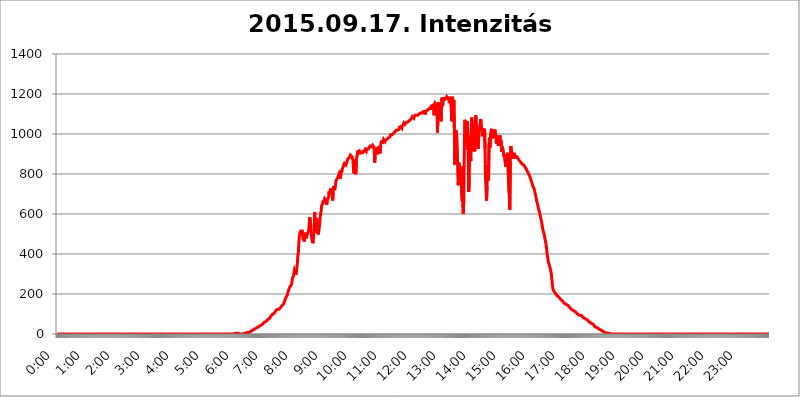
| Category | 2015.09.17. Intenzitás [W/m^2] |
|---|---|
| 0.0 | 0 |
| 0.0006944444444444445 | 0 |
| 0.001388888888888889 | 0 |
| 0.0020833333333333333 | 0 |
| 0.002777777777777778 | 0 |
| 0.003472222222222222 | 0 |
| 0.004166666666666667 | 0 |
| 0.004861111111111111 | 0 |
| 0.005555555555555556 | 0 |
| 0.0062499999999999995 | 0 |
| 0.006944444444444444 | 0 |
| 0.007638888888888889 | 0 |
| 0.008333333333333333 | 0 |
| 0.009027777777777779 | 0 |
| 0.009722222222222222 | 0 |
| 0.010416666666666666 | 0 |
| 0.011111111111111112 | 0 |
| 0.011805555555555555 | 0 |
| 0.012499999999999999 | 0 |
| 0.013194444444444444 | 0 |
| 0.013888888888888888 | 0 |
| 0.014583333333333332 | 0 |
| 0.015277777777777777 | 0 |
| 0.015972222222222224 | 0 |
| 0.016666666666666666 | 0 |
| 0.017361111111111112 | 0 |
| 0.018055555555555557 | 0 |
| 0.01875 | 0 |
| 0.019444444444444445 | 0 |
| 0.02013888888888889 | 0 |
| 0.020833333333333332 | 0 |
| 0.02152777777777778 | 0 |
| 0.022222222222222223 | 0 |
| 0.02291666666666667 | 0 |
| 0.02361111111111111 | 0 |
| 0.024305555555555556 | 0 |
| 0.024999999999999998 | 0 |
| 0.025694444444444447 | 0 |
| 0.02638888888888889 | 0 |
| 0.027083333333333334 | 0 |
| 0.027777777777777776 | 0 |
| 0.02847222222222222 | 0 |
| 0.029166666666666664 | 0 |
| 0.029861111111111113 | 0 |
| 0.030555555555555555 | 0 |
| 0.03125 | 0 |
| 0.03194444444444445 | 0 |
| 0.03263888888888889 | 0 |
| 0.03333333333333333 | 0 |
| 0.034027777777777775 | 0 |
| 0.034722222222222224 | 0 |
| 0.035416666666666666 | 0 |
| 0.036111111111111115 | 0 |
| 0.03680555555555556 | 0 |
| 0.0375 | 0 |
| 0.03819444444444444 | 0 |
| 0.03888888888888889 | 0 |
| 0.03958333333333333 | 0 |
| 0.04027777777777778 | 0 |
| 0.04097222222222222 | 0 |
| 0.041666666666666664 | 0 |
| 0.042361111111111106 | 0 |
| 0.04305555555555556 | 0 |
| 0.043750000000000004 | 0 |
| 0.044444444444444446 | 0 |
| 0.04513888888888889 | 0 |
| 0.04583333333333334 | 0 |
| 0.04652777777777778 | 0 |
| 0.04722222222222222 | 0 |
| 0.04791666666666666 | 0 |
| 0.04861111111111111 | 0 |
| 0.049305555555555554 | 0 |
| 0.049999999999999996 | 0 |
| 0.05069444444444445 | 0 |
| 0.051388888888888894 | 0 |
| 0.052083333333333336 | 0 |
| 0.05277777777777778 | 0 |
| 0.05347222222222222 | 0 |
| 0.05416666666666667 | 0 |
| 0.05486111111111111 | 0 |
| 0.05555555555555555 | 0 |
| 0.05625 | 0 |
| 0.05694444444444444 | 0 |
| 0.057638888888888885 | 0 |
| 0.05833333333333333 | 0 |
| 0.05902777777777778 | 0 |
| 0.059722222222222225 | 0 |
| 0.06041666666666667 | 0 |
| 0.061111111111111116 | 0 |
| 0.06180555555555556 | 0 |
| 0.0625 | 0 |
| 0.06319444444444444 | 0 |
| 0.06388888888888888 | 0 |
| 0.06458333333333334 | 0 |
| 0.06527777777777778 | 0 |
| 0.06597222222222222 | 0 |
| 0.06666666666666667 | 0 |
| 0.06736111111111111 | 0 |
| 0.06805555555555555 | 0 |
| 0.06874999999999999 | 0 |
| 0.06944444444444443 | 0 |
| 0.07013888888888889 | 0 |
| 0.07083333333333333 | 0 |
| 0.07152777777777779 | 0 |
| 0.07222222222222223 | 0 |
| 0.07291666666666667 | 0 |
| 0.07361111111111111 | 0 |
| 0.07430555555555556 | 0 |
| 0.075 | 0 |
| 0.07569444444444444 | 0 |
| 0.0763888888888889 | 0 |
| 0.07708333333333334 | 0 |
| 0.07777777777777778 | 0 |
| 0.07847222222222222 | 0 |
| 0.07916666666666666 | 0 |
| 0.0798611111111111 | 0 |
| 0.08055555555555556 | 0 |
| 0.08125 | 0 |
| 0.08194444444444444 | 0 |
| 0.08263888888888889 | 0 |
| 0.08333333333333333 | 0 |
| 0.08402777777777777 | 0 |
| 0.08472222222222221 | 0 |
| 0.08541666666666665 | 0 |
| 0.08611111111111112 | 0 |
| 0.08680555555555557 | 0 |
| 0.08750000000000001 | 0 |
| 0.08819444444444445 | 0 |
| 0.08888888888888889 | 0 |
| 0.08958333333333333 | 0 |
| 0.09027777777777778 | 0 |
| 0.09097222222222222 | 0 |
| 0.09166666666666667 | 0 |
| 0.09236111111111112 | 0 |
| 0.09305555555555556 | 0 |
| 0.09375 | 0 |
| 0.09444444444444444 | 0 |
| 0.09513888888888888 | 0 |
| 0.09583333333333333 | 0 |
| 0.09652777777777777 | 0 |
| 0.09722222222222222 | 0 |
| 0.09791666666666667 | 0 |
| 0.09861111111111111 | 0 |
| 0.09930555555555555 | 0 |
| 0.09999999999999999 | 0 |
| 0.10069444444444443 | 0 |
| 0.1013888888888889 | 0 |
| 0.10208333333333335 | 0 |
| 0.10277777777777779 | 0 |
| 0.10347222222222223 | 0 |
| 0.10416666666666667 | 0 |
| 0.10486111111111111 | 0 |
| 0.10555555555555556 | 0 |
| 0.10625 | 0 |
| 0.10694444444444444 | 0 |
| 0.1076388888888889 | 0 |
| 0.10833333333333334 | 0 |
| 0.10902777777777778 | 0 |
| 0.10972222222222222 | 0 |
| 0.1111111111111111 | 0 |
| 0.11180555555555556 | 0 |
| 0.11180555555555556 | 0 |
| 0.1125 | 0 |
| 0.11319444444444444 | 0 |
| 0.11388888888888889 | 0 |
| 0.11458333333333333 | 0 |
| 0.11527777777777777 | 0 |
| 0.11597222222222221 | 0 |
| 0.11666666666666665 | 0 |
| 0.1173611111111111 | 0 |
| 0.11805555555555557 | 0 |
| 0.11944444444444445 | 0 |
| 0.12013888888888889 | 0 |
| 0.12083333333333333 | 0 |
| 0.12152777777777778 | 0 |
| 0.12222222222222223 | 0 |
| 0.12291666666666667 | 0 |
| 0.12291666666666667 | 0 |
| 0.12361111111111112 | 0 |
| 0.12430555555555556 | 0 |
| 0.125 | 0 |
| 0.12569444444444444 | 0 |
| 0.12638888888888888 | 0 |
| 0.12708333333333333 | 0 |
| 0.16875 | 0 |
| 0.12847222222222224 | 0 |
| 0.12916666666666668 | 0 |
| 0.12986111111111112 | 0 |
| 0.13055555555555556 | 0 |
| 0.13125 | 0 |
| 0.13194444444444445 | 0 |
| 0.1326388888888889 | 0 |
| 0.13333333333333333 | 0 |
| 0.13402777777777777 | 0 |
| 0.13402777777777777 | 0 |
| 0.13472222222222222 | 0 |
| 0.13541666666666666 | 0 |
| 0.1361111111111111 | 0 |
| 0.13749999999999998 | 0 |
| 0.13819444444444443 | 0 |
| 0.1388888888888889 | 0 |
| 0.13958333333333334 | 0 |
| 0.14027777777777778 | 0 |
| 0.14097222222222222 | 0 |
| 0.14166666666666666 | 0 |
| 0.1423611111111111 | 0 |
| 0.14305555555555557 | 0 |
| 0.14375000000000002 | 0 |
| 0.14444444444444446 | 0 |
| 0.1451388888888889 | 0 |
| 0.1451388888888889 | 0 |
| 0.14652777777777778 | 0 |
| 0.14722222222222223 | 0 |
| 0.14791666666666667 | 0 |
| 0.1486111111111111 | 0 |
| 0.14930555555555555 | 0 |
| 0.15 | 0 |
| 0.15069444444444444 | 0 |
| 0.15138888888888888 | 0 |
| 0.15208333333333332 | 0 |
| 0.15277777777777776 | 0 |
| 0.15347222222222223 | 0 |
| 0.15416666666666667 | 0 |
| 0.15486111111111112 | 0 |
| 0.15555555555555556 | 0 |
| 0.15625 | 0 |
| 0.15694444444444444 | 0 |
| 0.15763888888888888 | 0 |
| 0.15833333333333333 | 0 |
| 0.15902777777777777 | 0 |
| 0.15972222222222224 | 0 |
| 0.16041666666666668 | 0 |
| 0.16111111111111112 | 0 |
| 0.16180555555555556 | 0 |
| 0.1625 | 0 |
| 0.16319444444444445 | 0 |
| 0.1638888888888889 | 0 |
| 0.16458333333333333 | 0 |
| 0.16527777777777777 | 0 |
| 0.16597222222222222 | 0 |
| 0.16666666666666666 | 0 |
| 0.1673611111111111 | 0 |
| 0.16805555555555554 | 0 |
| 0.16874999999999998 | 0 |
| 0.16944444444444443 | 0 |
| 0.17013888888888887 | 0 |
| 0.1708333333333333 | 0 |
| 0.17152777777777775 | 0 |
| 0.17222222222222225 | 0 |
| 0.1729166666666667 | 0 |
| 0.17361111111111113 | 0 |
| 0.17430555555555557 | 0 |
| 0.17500000000000002 | 0 |
| 0.17569444444444446 | 0 |
| 0.1763888888888889 | 0 |
| 0.17708333333333334 | 0 |
| 0.17777777777777778 | 0 |
| 0.17847222222222223 | 0 |
| 0.17916666666666667 | 0 |
| 0.1798611111111111 | 0 |
| 0.18055555555555555 | 0 |
| 0.18125 | 0 |
| 0.18194444444444444 | 0 |
| 0.1826388888888889 | 0 |
| 0.18333333333333335 | 0 |
| 0.1840277777777778 | 0 |
| 0.18472222222222223 | 0 |
| 0.18541666666666667 | 0 |
| 0.18611111111111112 | 0 |
| 0.18680555555555556 | 0 |
| 0.1875 | 0 |
| 0.18819444444444444 | 0 |
| 0.18888888888888888 | 0 |
| 0.18958333333333333 | 0 |
| 0.19027777777777777 | 0 |
| 0.1909722222222222 | 0 |
| 0.19166666666666665 | 0 |
| 0.19236111111111112 | 0 |
| 0.19305555555555554 | 0 |
| 0.19375 | 0 |
| 0.19444444444444445 | 0 |
| 0.1951388888888889 | 0 |
| 0.19583333333333333 | 0 |
| 0.19652777777777777 | 0 |
| 0.19722222222222222 | 0 |
| 0.19791666666666666 | 0 |
| 0.1986111111111111 | 0 |
| 0.19930555555555554 | 0 |
| 0.19999999999999998 | 0 |
| 0.20069444444444443 | 0 |
| 0.20138888888888887 | 0 |
| 0.2020833333333333 | 0 |
| 0.2027777777777778 | 0 |
| 0.2034722222222222 | 0 |
| 0.2041666666666667 | 0 |
| 0.20486111111111113 | 0 |
| 0.20555555555555557 | 0 |
| 0.20625000000000002 | 0 |
| 0.20694444444444446 | 0 |
| 0.2076388888888889 | 0 |
| 0.20833333333333334 | 0 |
| 0.20902777777777778 | 0 |
| 0.20972222222222223 | 0 |
| 0.21041666666666667 | 0 |
| 0.2111111111111111 | 0 |
| 0.21180555555555555 | 0 |
| 0.2125 | 0 |
| 0.21319444444444444 | 0 |
| 0.2138888888888889 | 0 |
| 0.21458333333333335 | 0 |
| 0.2152777777777778 | 0 |
| 0.21597222222222223 | 0 |
| 0.21666666666666667 | 0 |
| 0.21736111111111112 | 0 |
| 0.21805555555555556 | 0 |
| 0.21875 | 0 |
| 0.21944444444444444 | 0 |
| 0.22013888888888888 | 0 |
| 0.22083333333333333 | 0 |
| 0.22152777777777777 | 0 |
| 0.2222222222222222 | 0 |
| 0.22291666666666665 | 0 |
| 0.2236111111111111 | 0 |
| 0.22430555555555556 | 0 |
| 0.225 | 0 |
| 0.22569444444444445 | 0 |
| 0.2263888888888889 | 0 |
| 0.22708333333333333 | 0 |
| 0.22777777777777777 | 0 |
| 0.22847222222222222 | 0 |
| 0.22916666666666666 | 0 |
| 0.2298611111111111 | 0 |
| 0.23055555555555554 | 0 |
| 0.23124999999999998 | 0 |
| 0.23194444444444443 | 0 |
| 0.23263888888888887 | 0 |
| 0.2333333333333333 | 0 |
| 0.2340277777777778 | 0 |
| 0.2347222222222222 | 0 |
| 0.2354166666666667 | 0 |
| 0.23611111111111113 | 0 |
| 0.23680555555555557 | 0 |
| 0.23750000000000002 | 0 |
| 0.23819444444444446 | 0 |
| 0.2388888888888889 | 0 |
| 0.23958333333333334 | 0 |
| 0.24027777777777778 | 0 |
| 0.24097222222222223 | 0 |
| 0.24166666666666667 | 0 |
| 0.2423611111111111 | 0 |
| 0.24305555555555555 | 0 |
| 0.24375 | 0 |
| 0.24444444444444446 | 0 |
| 0.24513888888888888 | 0 |
| 0.24583333333333335 | 0 |
| 0.2465277777777778 | 0 |
| 0.24722222222222223 | 0 |
| 0.24791666666666667 | 0 |
| 0.24861111111111112 | 0 |
| 0.24930555555555556 | 0 |
| 0.25 | 3.525 |
| 0.25069444444444444 | 3.525 |
| 0.2513888888888889 | 3.525 |
| 0.2520833333333333 | 3.525 |
| 0.25277777777777777 | 3.525 |
| 0.2534722222222222 | 3.525 |
| 0.25416666666666665 | 3.525 |
| 0.2548611111111111 | 0 |
| 0.2555555555555556 | 0 |
| 0.25625000000000003 | 0 |
| 0.2569444444444445 | 0 |
| 0.2576388888888889 | 0 |
| 0.25833333333333336 | 0 |
| 0.2590277777777778 | 0 |
| 0.25972222222222224 | 0 |
| 0.2604166666666667 | 0 |
| 0.2611111111111111 | 0 |
| 0.26180555555555557 | 0 |
| 0.2625 | 3.525 |
| 0.26319444444444445 | 3.525 |
| 0.2638888888888889 | 3.525 |
| 0.26458333333333334 | 3.525 |
| 0.2652777777777778 | 3.525 |
| 0.2659722222222222 | 7.887 |
| 0.26666666666666666 | 7.887 |
| 0.2673611111111111 | 7.887 |
| 0.26805555555555555 | 7.887 |
| 0.26875 | 7.887 |
| 0.26944444444444443 | 12.257 |
| 0.2701388888888889 | 12.257 |
| 0.2708333333333333 | 12.257 |
| 0.27152777777777776 | 12.257 |
| 0.2722222222222222 | 16.636 |
| 0.27291666666666664 | 16.636 |
| 0.2736111111111111 | 21.024 |
| 0.2743055555555555 | 21.024 |
| 0.27499999999999997 | 21.024 |
| 0.27569444444444446 | 21.024 |
| 0.27638888888888885 | 25.419 |
| 0.27708333333333335 | 25.419 |
| 0.2777777777777778 | 25.419 |
| 0.27847222222222223 | 29.823 |
| 0.2791666666666667 | 29.823 |
| 0.2798611111111111 | 29.823 |
| 0.28055555555555556 | 34.234 |
| 0.28125 | 34.234 |
| 0.28194444444444444 | 38.653 |
| 0.2826388888888889 | 38.653 |
| 0.2833333333333333 | 38.653 |
| 0.28402777777777777 | 43.079 |
| 0.2847222222222222 | 43.079 |
| 0.28541666666666665 | 43.079 |
| 0.28611111111111115 | 47.511 |
| 0.28680555555555554 | 47.511 |
| 0.28750000000000003 | 47.511 |
| 0.2881944444444445 | 51.951 |
| 0.2888888888888889 | 51.951 |
| 0.28958333333333336 | 56.398 |
| 0.2902777777777778 | 56.398 |
| 0.29097222222222224 | 56.398 |
| 0.2916666666666667 | 60.85 |
| 0.2923611111111111 | 60.85 |
| 0.29305555555555557 | 65.31 |
| 0.29375 | 65.31 |
| 0.29444444444444445 | 69.775 |
| 0.2951388888888889 | 69.775 |
| 0.29583333333333334 | 74.246 |
| 0.2965277777777778 | 74.246 |
| 0.2972222222222222 | 78.722 |
| 0.29791666666666666 | 78.722 |
| 0.2986111111111111 | 83.205 |
| 0.29930555555555555 | 87.692 |
| 0.3 | 87.692 |
| 0.30069444444444443 | 92.184 |
| 0.3013888888888889 | 96.682 |
| 0.3020833333333333 | 96.682 |
| 0.30277777777777776 | 101.184 |
| 0.3034722222222222 | 101.184 |
| 0.30416666666666664 | 105.69 |
| 0.3048611111111111 | 105.69 |
| 0.3055555555555555 | 110.201 |
| 0.30624999999999997 | 114.716 |
| 0.3069444444444444 | 119.235 |
| 0.3076388888888889 | 123.758 |
| 0.30833333333333335 | 123.758 |
| 0.3090277777777778 | 123.758 |
| 0.30972222222222223 | 123.758 |
| 0.3104166666666667 | 123.758 |
| 0.3111111111111111 | 123.758 |
| 0.31180555555555556 | 128.284 |
| 0.3125 | 128.284 |
| 0.31319444444444444 | 132.814 |
| 0.3138888888888889 | 137.347 |
| 0.3145833333333333 | 137.347 |
| 0.31527777777777777 | 141.884 |
| 0.3159722222222222 | 141.884 |
| 0.31666666666666665 | 146.423 |
| 0.31736111111111115 | 150.964 |
| 0.31805555555555554 | 155.509 |
| 0.31875000000000003 | 160.056 |
| 0.3194444444444445 | 169.156 |
| 0.3201388888888889 | 178.264 |
| 0.32083333333333336 | 182.82 |
| 0.3215277777777778 | 187.378 |
| 0.32222222222222224 | 187.378 |
| 0.3229166666666667 | 196.497 |
| 0.3236111111111111 | 210.182 |
| 0.32430555555555557 | 210.182 |
| 0.325 | 223.873 |
| 0.32569444444444445 | 228.436 |
| 0.3263888888888889 | 237.564 |
| 0.32708333333333334 | 242.127 |
| 0.3277777777777778 | 242.127 |
| 0.3284722222222222 | 246.689 |
| 0.32916666666666666 | 260.373 |
| 0.3298611111111111 | 278.603 |
| 0.33055555555555555 | 278.603 |
| 0.33125 | 287.709 |
| 0.33194444444444443 | 305.898 |
| 0.3326388888888889 | 319.517 |
| 0.3333333333333333 | 314.98 |
| 0.3340277777777778 | 305.898 |
| 0.3347222222222222 | 296.808 |
| 0.3354166666666667 | 314.98 |
| 0.3361111111111111 | 333.113 |
| 0.3368055555555556 | 355.712 |
| 0.33749999999999997 | 391.685 |
| 0.33819444444444446 | 409.574 |
| 0.33888888888888885 | 458.38 |
| 0.33958333333333335 | 489.108 |
| 0.34027777777777773 | 502.192 |
| 0.34097222222222223 | 497.836 |
| 0.3416666666666666 | 515.223 |
| 0.3423611111111111 | 510.885 |
| 0.3430555555555555 | 519.555 |
| 0.34375 | 515.223 |
| 0.3444444444444445 | 484.735 |
| 0.3451388888888889 | 471.582 |
| 0.3458333333333334 | 489.108 |
| 0.34652777777777777 | 462.786 |
| 0.34722222222222227 | 506.542 |
| 0.34791666666666665 | 493.475 |
| 0.34861111111111115 | 475.972 |
| 0.34930555555555554 | 489.108 |
| 0.35000000000000003 | 493.475 |
| 0.3506944444444444 | 497.836 |
| 0.3513888888888889 | 502.192 |
| 0.3520833333333333 | 502.192 |
| 0.3527777777777778 | 519.555 |
| 0.3534722222222222 | 553.986 |
| 0.3541666666666667 | 583.779 |
| 0.3548611111111111 | 588.009 |
| 0.35555555555555557 | 536.82 |
| 0.35625 | 497.836 |
| 0.35694444444444445 | 480.356 |
| 0.3576388888888889 | 475.972 |
| 0.35833333333333334 | 453.968 |
| 0.3590277777777778 | 462.786 |
| 0.3597222222222222 | 497.836 |
| 0.36041666666666666 | 532.513 |
| 0.3611111111111111 | 609.062 |
| 0.36180555555555555 | 536.82 |
| 0.3625 | 506.542 |
| 0.36319444444444443 | 532.513 |
| 0.3638888888888889 | 579.542 |
| 0.3645833333333333 | 558.261 |
| 0.3652777777777778 | 515.223 |
| 0.3659722222222222 | 497.836 |
| 0.3666666666666667 | 510.885 |
| 0.3673611111111111 | 515.223 |
| 0.3680555555555556 | 549.704 |
| 0.36874999999999997 | 583.779 |
| 0.36944444444444446 | 583.779 |
| 0.37013888888888885 | 617.436 |
| 0.37083333333333335 | 642.4 |
| 0.37152777777777773 | 642.4 |
| 0.37222222222222223 | 650.667 |
| 0.3729166666666666 | 667.123 |
| 0.3736111111111111 | 654.791 |
| 0.3743055555555555 | 658.909 |
| 0.375 | 675.311 |
| 0.3756944444444445 | 675.311 |
| 0.3763888888888889 | 667.123 |
| 0.3770833333333334 | 663.019 |
| 0.37777777777777777 | 646.537 |
| 0.37847222222222227 | 658.909 |
| 0.37916666666666665 | 675.311 |
| 0.37986111111111115 | 675.311 |
| 0.38055555555555554 | 683.473 |
| 0.38125000000000003 | 711.832 |
| 0.3819444444444444 | 695.666 |
| 0.3826388888888889 | 711.832 |
| 0.3833333333333333 | 727.896 |
| 0.3840277777777778 | 695.666 |
| 0.3847222222222222 | 723.889 |
| 0.3854166666666667 | 703.762 |
| 0.3861111111111111 | 667.123 |
| 0.38680555555555557 | 679.395 |
| 0.3875 | 739.877 |
| 0.38819444444444445 | 731.896 |
| 0.3888888888888889 | 719.877 |
| 0.38958333333333334 | 727.896 |
| 0.3902777777777778 | 727.896 |
| 0.3909722222222222 | 767.62 |
| 0.39166666666666666 | 763.674 |
| 0.3923611111111111 | 767.62 |
| 0.39305555555555555 | 779.42 |
| 0.39375 | 783.342 |
| 0.39444444444444443 | 791.169 |
| 0.3951388888888889 | 798.974 |
| 0.3958333333333333 | 795.074 |
| 0.3965277777777778 | 795.074 |
| 0.3972222222222222 | 775.492 |
| 0.3979166666666667 | 818.392 |
| 0.3986111111111111 | 806.757 |
| 0.3993055555555556 | 818.392 |
| 0.39999999999999997 | 818.392 |
| 0.40069444444444446 | 814.519 |
| 0.40138888888888885 | 841.526 |
| 0.40208333333333335 | 845.365 |
| 0.40277777777777773 | 853.029 |
| 0.40347222222222223 | 856.855 |
| 0.4041666666666666 | 853.029 |
| 0.4048611111111111 | 845.365 |
| 0.4055555555555555 | 853.029 |
| 0.40625 | 856.855 |
| 0.4069444444444445 | 868.305 |
| 0.4076388888888889 | 875.918 |
| 0.4083333333333334 | 875.918 |
| 0.40902777777777777 | 879.719 |
| 0.40972222222222227 | 883.516 |
| 0.41041666666666665 | 887.309 |
| 0.41111111111111115 | 894.885 |
| 0.41180555555555554 | 898.668 |
| 0.41250000000000003 | 894.885 |
| 0.4131944444444444 | 887.309 |
| 0.4138888888888889 | 887.309 |
| 0.4145833333333333 | 872.114 |
| 0.4152777777777778 | 837.682 |
| 0.4159722222222222 | 802.868 |
| 0.4166666666666667 | 818.392 |
| 0.4173611111111111 | 872.114 |
| 0.41805555555555557 | 810.641 |
| 0.41875 | 798.974 |
| 0.41944444444444445 | 864.493 |
| 0.4201388888888889 | 887.309 |
| 0.42083333333333334 | 894.885 |
| 0.4215277777777778 | 917.534 |
| 0.4222222222222222 | 909.996 |
| 0.42291666666666666 | 917.534 |
| 0.4236111111111111 | 898.668 |
| 0.42430555555555555 | 913.766 |
| 0.425 | 917.534 |
| 0.42569444444444443 | 909.996 |
| 0.4263888888888889 | 906.223 |
| 0.4270833333333333 | 909.996 |
| 0.4277777777777778 | 906.223 |
| 0.4284722222222222 | 906.223 |
| 0.4291666666666667 | 913.766 |
| 0.4298611111111111 | 913.766 |
| 0.4305555555555556 | 917.534 |
| 0.43124999999999997 | 913.766 |
| 0.43194444444444446 | 921.298 |
| 0.43263888888888885 | 921.298 |
| 0.43333333333333335 | 913.766 |
| 0.43402777777777773 | 925.06 |
| 0.43472222222222223 | 928.819 |
| 0.4354166666666666 | 925.06 |
| 0.4361111111111111 | 925.06 |
| 0.4368055555555555 | 928.819 |
| 0.4375 | 932.576 |
| 0.4381944444444445 | 932.576 |
| 0.4388888888888889 | 940.082 |
| 0.4395833333333334 | 936.33 |
| 0.44027777777777777 | 940.082 |
| 0.44097222222222227 | 936.33 |
| 0.44166666666666665 | 940.082 |
| 0.44236111111111115 | 943.832 |
| 0.44305555555555554 | 943.832 |
| 0.44375000000000003 | 947.58 |
| 0.4444444444444444 | 932.576 |
| 0.4451388888888889 | 856.855 |
| 0.4458333333333333 | 887.309 |
| 0.4465277777777778 | 932.576 |
| 0.4472222222222222 | 936.33 |
| 0.4479166666666667 | 921.298 |
| 0.4486111111111111 | 898.668 |
| 0.44930555555555557 | 898.668 |
| 0.45 | 925.06 |
| 0.45069444444444445 | 925.06 |
| 0.4513888888888889 | 940.082 |
| 0.45208333333333334 | 921.298 |
| 0.4527777777777778 | 902.447 |
| 0.4534722222222222 | 936.33 |
| 0.45416666666666666 | 958.814 |
| 0.4548611111111111 | 966.295 |
| 0.45555555555555555 | 951.327 |
| 0.45625 | 947.58 |
| 0.45694444444444443 | 966.295 |
| 0.4576388888888889 | 973.772 |
| 0.4583333333333333 | 970.034 |
| 0.4590277777777778 | 970.034 |
| 0.4597222222222222 | 962.555 |
| 0.4604166666666667 | 970.034 |
| 0.4611111111111111 | 970.034 |
| 0.4618055555555556 | 970.034 |
| 0.46249999999999997 | 973.772 |
| 0.46319444444444446 | 977.508 |
| 0.46388888888888885 | 977.508 |
| 0.46458333333333335 | 981.244 |
| 0.46527777777777773 | 977.508 |
| 0.46597222222222223 | 984.98 |
| 0.4666666666666666 | 984.98 |
| 0.4673611111111111 | 996.182 |
| 0.4680555555555555 | 996.182 |
| 0.46875 | 996.182 |
| 0.4694444444444445 | 996.182 |
| 0.4701388888888889 | 999.916 |
| 0.4708333333333334 | 999.916 |
| 0.47152777777777777 | 1003.65 |
| 0.47222222222222227 | 1007.383 |
| 0.47291666666666665 | 1003.65 |
| 0.47361111111111115 | 1011.118 |
| 0.47430555555555554 | 1014.852 |
| 0.47500000000000003 | 1018.587 |
| 0.4756944444444444 | 1022.323 |
| 0.4763888888888889 | 1014.852 |
| 0.4770833333333333 | 1018.587 |
| 0.4777777777777778 | 1022.323 |
| 0.4784722222222222 | 1022.323 |
| 0.4791666666666667 | 1022.323 |
| 0.4798611111111111 | 1033.537 |
| 0.48055555555555557 | 1029.798 |
| 0.48125 | 1037.277 |
| 0.48194444444444445 | 1037.277 |
| 0.4826388888888889 | 1037.277 |
| 0.48333333333333334 | 1029.798 |
| 0.4840277777777778 | 1041.019 |
| 0.4847222222222222 | 1037.277 |
| 0.48541666666666666 | 1044.762 |
| 0.4861111111111111 | 1056.004 |
| 0.48680555555555555 | 1052.255 |
| 0.4875 | 1048.508 |
| 0.48819444444444443 | 1052.255 |
| 0.4888888888888889 | 1056.004 |
| 0.4895833333333333 | 1059.756 |
| 0.4902777777777778 | 1052.255 |
| 0.4909722222222222 | 1059.756 |
| 0.4916666666666667 | 1059.756 |
| 0.4923611111111111 | 1063.51 |
| 0.4930555555555556 | 1063.51 |
| 0.49374999999999997 | 1059.756 |
| 0.49444444444444446 | 1067.267 |
| 0.49513888888888885 | 1071.027 |
| 0.49583333333333335 | 1067.267 |
| 0.49652777777777773 | 1074.789 |
| 0.49722222222222223 | 1078.555 |
| 0.4979166666666666 | 1086.097 |
| 0.4986111111111111 | 1082.324 |
| 0.4993055555555555 | 1082.324 |
| 0.5 | 1078.555 |
| 0.5006944444444444 | 1078.555 |
| 0.5013888888888889 | 1093.653 |
| 0.5020833333333333 | 1093.653 |
| 0.5027777777777778 | 1097.437 |
| 0.5034722222222222 | 1093.653 |
| 0.5041666666666667 | 1097.437 |
| 0.5048611111111111 | 1093.653 |
| 0.5055555555555555 | 1093.653 |
| 0.50625 | 1093.653 |
| 0.5069444444444444 | 1097.437 |
| 0.5076388888888889 | 1101.226 |
| 0.5083333333333333 | 1101.226 |
| 0.5090277777777777 | 1105.019 |
| 0.5097222222222222 | 1105.019 |
| 0.5104166666666666 | 1108.816 |
| 0.5111111111111112 | 1108.816 |
| 0.5118055555555555 | 1105.019 |
| 0.5125000000000001 | 1105.019 |
| 0.5131944444444444 | 1112.618 |
| 0.513888888888889 | 1112.618 |
| 0.5145833333333333 | 1112.618 |
| 0.5152777777777778 | 1112.618 |
| 0.5159722222222222 | 1097.437 |
| 0.5166666666666667 | 1108.816 |
| 0.517361111111111 | 1112.618 |
| 0.5180555555555556 | 1116.426 |
| 0.5187499999999999 | 1120.238 |
| 0.5194444444444445 | 1116.426 |
| 0.5201388888888888 | 1120.238 |
| 0.5208333333333334 | 1124.056 |
| 0.5215277777777778 | 1127.879 |
| 0.5222222222222223 | 1127.879 |
| 0.5229166666666667 | 1131.708 |
| 0.5236111111111111 | 1127.879 |
| 0.5243055555555556 | 1139.384 |
| 0.525 | 1135.543 |
| 0.5256944444444445 | 1143.232 |
| 0.5263888888888889 | 1143.232 |
| 0.5270833333333333 | 1143.232 |
| 0.5277777777777778 | 1131.708 |
| 0.5284722222222222 | 1093.653 |
| 0.5291666666666667 | 1147.086 |
| 0.5298611111111111 | 1154.814 |
| 0.5305555555555556 | 1158.689 |
| 0.53125 | 1147.086 |
| 0.5319444444444444 | 1143.232 |
| 0.5326388888888889 | 1101.226 |
| 0.5333333333333333 | 1007.383 |
| 0.5340277777777778 | 1139.384 |
| 0.5347222222222222 | 1158.689 |
| 0.5354166666666667 | 1108.816 |
| 0.5361111111111111 | 1093.653 |
| 0.5368055555555555 | 1082.324 |
| 0.5375 | 1112.618 |
| 0.5381944444444444 | 1063.51 |
| 0.5388888888888889 | 1150.946 |
| 0.5395833333333333 | 1182.099 |
| 0.5402777777777777 | 1139.384 |
| 0.5409722222222222 | 1150.946 |
| 0.5416666666666666 | 1182.099 |
| 0.5423611111111112 | 1178.177 |
| 0.5430555555555555 | 1166.46 |
| 0.5437500000000001 | 1178.177 |
| 0.5444444444444444 | 1178.177 |
| 0.545138888888889 | 1178.177 |
| 0.5458333333333333 | 1178.177 |
| 0.5465277777777778 | 1186.03 |
| 0.5472222222222222 | 1182.099 |
| 0.5479166666666667 | 1186.03 |
| 0.548611111111111 | 1178.177 |
| 0.5493055555555556 | 1178.177 |
| 0.5499999999999999 | 1154.814 |
| 0.5506944444444445 | 1178.177 |
| 0.5513888888888888 | 1186.03 |
| 0.5520833333333334 | 1147.086 |
| 0.5527777777777778 | 1112.618 |
| 0.5534722222222223 | 1063.51 |
| 0.5541666666666667 | 1186.03 |
| 0.5548611111111111 | 1170.358 |
| 0.5555555555555556 | 1154.814 |
| 0.55625 | 1170.358 |
| 0.5569444444444445 | 1029.798 |
| 0.5576388888888889 | 845.365 |
| 0.5583333333333333 | 970.034 |
| 0.5590277777777778 | 1018.587 |
| 0.5597222222222222 | 1011.118 |
| 0.5604166666666667 | 984.98 |
| 0.5611111111111111 | 925.06 |
| 0.5618055555555556 | 806.757 |
| 0.5625 | 743.859 |
| 0.5631944444444444 | 856.855 |
| 0.5638888888888889 | 837.682 |
| 0.5645833333333333 | 818.392 |
| 0.5652777777777778 | 798.974 |
| 0.5659722222222222 | 814.519 |
| 0.5666666666666667 | 837.682 |
| 0.5673611111111111 | 687.544 |
| 0.5680555555555555 | 663.019 |
| 0.56875 | 711.832 |
| 0.5694444444444444 | 600.661 |
| 0.5701388888888889 | 667.123 |
| 0.5708333333333333 | 887.309 |
| 0.5715277777777777 | 1071.027 |
| 0.5722222222222222 | 1059.756 |
| 0.5729166666666666 | 1044.762 |
| 0.5736111111111112 | 984.98 |
| 0.5743055555555555 | 966.295 |
| 0.5750000000000001 | 1063.51 |
| 0.5756944444444444 | 921.298 |
| 0.576388888888889 | 970.034 |
| 0.5770833333333333 | 711.832 |
| 0.5777777777777778 | 779.42 |
| 0.5784722222222222 | 928.819 |
| 0.5791666666666667 | 992.448 |
| 0.579861111111111 | 864.493 |
| 0.5805555555555556 | 1014.852 |
| 0.5812499999999999 | 1082.324 |
| 0.5819444444444445 | 1052.255 |
| 0.5826388888888888 | 1041.019 |
| 0.5833333333333334 | 913.766 |
| 0.5840277777777778 | 970.034 |
| 0.5847222222222223 | 1037.277 |
| 0.5854166666666667 | 913.766 |
| 0.5861111111111111 | 984.98 |
| 0.5868055555555556 | 1093.653 |
| 0.5875 | 1074.789 |
| 0.5881944444444445 | 1029.798 |
| 0.5888888888888889 | 958.814 |
| 0.5895833333333333 | 962.555 |
| 0.5902777777777778 | 925.06 |
| 0.5909722222222222 | 962.555 |
| 0.5916666666666667 | 1007.383 |
| 0.5923611111111111 | 1033.537 |
| 0.5930555555555556 | 1048.508 |
| 0.59375 | 1074.789 |
| 0.5944444444444444 | 1059.756 |
| 0.5951388888888889 | 1026.06 |
| 0.5958333333333333 | 1014.852 |
| 0.5965277777777778 | 988.714 |
| 0.5972222222222222 | 1026.06 |
| 0.5979166666666667 | 1026.06 |
| 0.5986111111111111 | 1007.383 |
| 0.5993055555555555 | 1026.06 |
| 0.6 | 925.06 |
| 0.6006944444444444 | 771.559 |
| 0.6013888888888889 | 735.89 |
| 0.6020833333333333 | 667.123 |
| 0.6027777777777777 | 735.89 |
| 0.6034722222222222 | 845.365 |
| 0.6041666666666666 | 833.834 |
| 0.6048611111111112 | 767.62 |
| 0.6055555555555555 | 947.58 |
| 0.6062500000000001 | 981.244 |
| 0.6069444444444444 | 932.576 |
| 0.607638888888889 | 996.182 |
| 0.6083333333333333 | 1011.118 |
| 0.6090277777777778 | 1026.06 |
| 0.6097222222222222 | 977.508 |
| 0.6104166666666667 | 996.182 |
| 0.611111111111111 | 1003.65 |
| 0.6118055555555556 | 981.244 |
| 0.6124999999999999 | 977.508 |
| 0.6131944444444445 | 1014.852 |
| 0.6138888888888888 | 1022.323 |
| 0.6145833333333334 | 981.244 |
| 0.6152777777777778 | 996.182 |
| 0.6159722222222223 | 951.327 |
| 0.6166666666666667 | 973.772 |
| 0.6173611111111111 | 981.244 |
| 0.6180555555555556 | 977.508 |
| 0.61875 | 940.082 |
| 0.6194444444444445 | 958.814 |
| 0.6201388888888889 | 940.082 |
| 0.6208333333333333 | 992.448 |
| 0.6215277777777778 | 955.071 |
| 0.6222222222222222 | 970.034 |
| 0.6229166666666667 | 940.082 |
| 0.6236111111111111 | 909.996 |
| 0.6243055555555556 | 936.33 |
| 0.625 | 925.06 |
| 0.6256944444444444 | 913.766 |
| 0.6263888888888889 | 887.309 |
| 0.6270833333333333 | 898.668 |
| 0.6277777777777778 | 898.668 |
| 0.6284722222222222 | 856.855 |
| 0.6291666666666667 | 837.682 |
| 0.6298611111111111 | 883.516 |
| 0.6305555555555555 | 837.682 |
| 0.63125 | 883.516 |
| 0.6319444444444444 | 906.223 |
| 0.6326388888888889 | 802.868 |
| 0.6333333333333333 | 711.832 |
| 0.6340277777777777 | 695.666 |
| 0.6347222222222222 | 621.613 |
| 0.6354166666666666 | 860.676 |
| 0.6361111111111112 | 940.082 |
| 0.6368055555555555 | 917.534 |
| 0.6375000000000001 | 909.996 |
| 0.6381944444444444 | 898.668 |
| 0.638888888888889 | 898.668 |
| 0.6395833333333333 | 875.918 |
| 0.6402777777777778 | 887.309 |
| 0.6409722222222222 | 906.223 |
| 0.6416666666666667 | 875.918 |
| 0.642361111111111 | 891.099 |
| 0.6430555555555556 | 894.885 |
| 0.6437499999999999 | 891.099 |
| 0.6444444444444445 | 887.309 |
| 0.6451388888888888 | 883.516 |
| 0.6458333333333334 | 879.719 |
| 0.6465277777777778 | 875.918 |
| 0.6472222222222223 | 872.114 |
| 0.6479166666666667 | 868.305 |
| 0.6486111111111111 | 864.493 |
| 0.6493055555555556 | 860.676 |
| 0.65 | 860.676 |
| 0.6506944444444445 | 856.855 |
| 0.6513888888888889 | 853.029 |
| 0.6520833333333333 | 849.199 |
| 0.6527777777777778 | 849.199 |
| 0.6534722222222222 | 845.365 |
| 0.6541666666666667 | 845.365 |
| 0.6548611111111111 | 841.526 |
| 0.6555555555555556 | 837.682 |
| 0.65625 | 833.834 |
| 0.6569444444444444 | 829.981 |
| 0.6576388888888889 | 826.123 |
| 0.6583333333333333 | 822.26 |
| 0.6590277777777778 | 814.519 |
| 0.6597222222222222 | 810.641 |
| 0.6604166666666667 | 806.757 |
| 0.6611111111111111 | 798.974 |
| 0.6618055555555555 | 795.074 |
| 0.6625 | 791.169 |
| 0.6631944444444444 | 783.342 |
| 0.6638888888888889 | 775.492 |
| 0.6645833333333333 | 767.62 |
| 0.6652777777777777 | 759.723 |
| 0.6659722222222222 | 751.803 |
| 0.6666666666666666 | 743.859 |
| 0.6673611111111111 | 735.89 |
| 0.6680555555555556 | 731.896 |
| 0.6687500000000001 | 727.896 |
| 0.6694444444444444 | 715.858 |
| 0.6701388888888888 | 703.762 |
| 0.6708333333333334 | 695.666 |
| 0.6715277777777778 | 683.473 |
| 0.6722222222222222 | 667.123 |
| 0.6729166666666666 | 663.019 |
| 0.6736111111111112 | 650.667 |
| 0.6743055555555556 | 638.256 |
| 0.6749999999999999 | 625.784 |
| 0.6756944444444444 | 621.613 |
| 0.6763888888888889 | 609.062 |
| 0.6770833333333334 | 596.45 |
| 0.6777777777777777 | 583.779 |
| 0.6784722222222223 | 575.299 |
| 0.6791666666666667 | 562.53 |
| 0.6798611111111111 | 549.704 |
| 0.6805555555555555 | 532.513 |
| 0.68125 | 519.555 |
| 0.6819444444444445 | 515.223 |
| 0.6826388888888889 | 502.192 |
| 0.6833333333333332 | 489.108 |
| 0.6840277777777778 | 475.972 |
| 0.6847222222222222 | 462.786 |
| 0.6854166666666667 | 449.551 |
| 0.686111111111111 | 431.833 |
| 0.6868055555555556 | 409.574 |
| 0.6875 | 391.685 |
| 0.6881944444444444 | 373.729 |
| 0.688888888888889 | 360.221 |
| 0.6895833333333333 | 351.198 |
| 0.6902777777777778 | 342.162 |
| 0.6909722222222222 | 333.113 |
| 0.6916666666666668 | 324.052 |
| 0.6923611111111111 | 310.44 |
| 0.6930555555555555 | 296.808 |
| 0.69375 | 269.49 |
| 0.6944444444444445 | 246.689 |
| 0.6951388888888889 | 228.436 |
| 0.6958333333333333 | 219.309 |
| 0.6965277777777777 | 214.746 |
| 0.6972222222222223 | 210.182 |
| 0.6979166666666666 | 205.62 |
| 0.6986111111111111 | 205.62 |
| 0.6993055555555556 | 201.058 |
| 0.7000000000000001 | 196.497 |
| 0.7006944444444444 | 191.937 |
| 0.7013888888888888 | 191.937 |
| 0.7020833333333334 | 187.378 |
| 0.7027777777777778 | 187.378 |
| 0.7034722222222222 | 182.82 |
| 0.7041666666666666 | 182.82 |
| 0.7048611111111112 | 178.264 |
| 0.7055555555555556 | 173.709 |
| 0.7062499999999999 | 173.709 |
| 0.7069444444444444 | 169.156 |
| 0.7076388888888889 | 169.156 |
| 0.7083333333333334 | 164.605 |
| 0.7090277777777777 | 164.605 |
| 0.7097222222222223 | 160.056 |
| 0.7104166666666667 | 155.509 |
| 0.7111111111111111 | 155.509 |
| 0.7118055555555555 | 155.509 |
| 0.7125 | 150.964 |
| 0.7131944444444445 | 146.423 |
| 0.7138888888888889 | 146.423 |
| 0.7145833333333332 | 146.423 |
| 0.7152777777777778 | 141.884 |
| 0.7159722222222222 | 141.884 |
| 0.7166666666666667 | 141.884 |
| 0.717361111111111 | 137.347 |
| 0.7180555555555556 | 137.347 |
| 0.71875 | 132.814 |
| 0.7194444444444444 | 132.814 |
| 0.720138888888889 | 128.284 |
| 0.7208333333333333 | 123.758 |
| 0.7215277777777778 | 123.758 |
| 0.7222222222222222 | 119.235 |
| 0.7229166666666668 | 119.235 |
| 0.7236111111111111 | 119.235 |
| 0.7243055555555555 | 114.716 |
| 0.725 | 114.716 |
| 0.7256944444444445 | 110.201 |
| 0.7263888888888889 | 110.201 |
| 0.7270833333333333 | 110.201 |
| 0.7277777777777777 | 105.69 |
| 0.7284722222222223 | 105.69 |
| 0.7291666666666666 | 101.184 |
| 0.7298611111111111 | 101.184 |
| 0.7305555555555556 | 101.184 |
| 0.7312500000000001 | 96.682 |
| 0.7319444444444444 | 96.682 |
| 0.7326388888888888 | 96.682 |
| 0.7333333333333334 | 92.184 |
| 0.7340277777777778 | 92.184 |
| 0.7347222222222222 | 92.184 |
| 0.7354166666666666 | 92.184 |
| 0.7361111111111112 | 87.692 |
| 0.7368055555555556 | 87.692 |
| 0.7374999999999999 | 83.205 |
| 0.7381944444444444 | 83.205 |
| 0.7388888888888889 | 83.205 |
| 0.7395833333333334 | 78.722 |
| 0.7402777777777777 | 78.722 |
| 0.7409722222222223 | 74.246 |
| 0.7416666666666667 | 74.246 |
| 0.7423611111111111 | 74.246 |
| 0.7430555555555555 | 69.775 |
| 0.74375 | 69.775 |
| 0.7444444444444445 | 65.31 |
| 0.7451388888888889 | 65.31 |
| 0.7458333333333332 | 60.85 |
| 0.7465277777777778 | 60.85 |
| 0.7472222222222222 | 56.398 |
| 0.7479166666666667 | 56.398 |
| 0.748611111111111 | 56.398 |
| 0.7493055555555556 | 56.398 |
| 0.75 | 51.951 |
| 0.7506944444444444 | 47.511 |
| 0.751388888888889 | 47.511 |
| 0.7520833333333333 | 47.511 |
| 0.7527777777777778 | 43.079 |
| 0.7534722222222222 | 38.653 |
| 0.7541666666666668 | 38.653 |
| 0.7548611111111111 | 38.653 |
| 0.7555555555555555 | 34.234 |
| 0.75625 | 34.234 |
| 0.7569444444444445 | 29.823 |
| 0.7576388888888889 | 29.823 |
| 0.7583333333333333 | 25.419 |
| 0.7590277777777777 | 25.419 |
| 0.7597222222222223 | 25.419 |
| 0.7604166666666666 | 25.419 |
| 0.7611111111111111 | 25.419 |
| 0.7618055555555556 | 21.024 |
| 0.7625000000000001 | 21.024 |
| 0.7631944444444444 | 21.024 |
| 0.7638888888888888 | 16.636 |
| 0.7645833333333334 | 16.636 |
| 0.7652777777777778 | 12.257 |
| 0.7659722222222222 | 12.257 |
| 0.7666666666666666 | 7.887 |
| 0.7673611111111112 | 7.887 |
| 0.7680555555555556 | 7.887 |
| 0.7687499999999999 | 3.525 |
| 0.7694444444444444 | 3.525 |
| 0.7701388888888889 | 3.525 |
| 0.7708333333333334 | 3.525 |
| 0.7715277777777777 | 3.525 |
| 0.7722222222222223 | 3.525 |
| 0.7729166666666667 | 3.525 |
| 0.7736111111111111 | 3.525 |
| 0.7743055555555555 | 3.525 |
| 0.775 | 3.525 |
| 0.7756944444444445 | 0 |
| 0.7763888888888889 | 0 |
| 0.7770833333333332 | 0 |
| 0.7777777777777778 | 0 |
| 0.7784722222222222 | 0 |
| 0.7791666666666667 | 0 |
| 0.779861111111111 | 0 |
| 0.7805555555555556 | 0 |
| 0.78125 | 0 |
| 0.7819444444444444 | 0 |
| 0.782638888888889 | 0 |
| 0.7833333333333333 | 0 |
| 0.7840277777777778 | 0 |
| 0.7847222222222222 | 0 |
| 0.7854166666666668 | 0 |
| 0.7861111111111111 | 0 |
| 0.7868055555555555 | 0 |
| 0.7875 | 0 |
| 0.7881944444444445 | 0 |
| 0.7888888888888889 | 0 |
| 0.7895833333333333 | 0 |
| 0.7902777777777777 | 0 |
| 0.7909722222222223 | 0 |
| 0.7916666666666666 | 0 |
| 0.7923611111111111 | 0 |
| 0.7930555555555556 | 0 |
| 0.7937500000000001 | 0 |
| 0.7944444444444444 | 0 |
| 0.7951388888888888 | 0 |
| 0.7958333333333334 | 0 |
| 0.7965277777777778 | 0 |
| 0.7972222222222222 | 0 |
| 0.7979166666666666 | 0 |
| 0.7986111111111112 | 0 |
| 0.7993055555555556 | 0 |
| 0.7999999999999999 | 0 |
| 0.8006944444444444 | 0 |
| 0.8013888888888889 | 0 |
| 0.8020833333333334 | 0 |
| 0.8027777777777777 | 0 |
| 0.8034722222222223 | 0 |
| 0.8041666666666667 | 0 |
| 0.8048611111111111 | 0 |
| 0.8055555555555555 | 0 |
| 0.80625 | 0 |
| 0.8069444444444445 | 0 |
| 0.8076388888888889 | 0 |
| 0.8083333333333332 | 0 |
| 0.8090277777777778 | 0 |
| 0.8097222222222222 | 0 |
| 0.8104166666666667 | 0 |
| 0.811111111111111 | 0 |
| 0.8118055555555556 | 0 |
| 0.8125 | 0 |
| 0.8131944444444444 | 0 |
| 0.813888888888889 | 0 |
| 0.8145833333333333 | 0 |
| 0.8152777777777778 | 0 |
| 0.8159722222222222 | 0 |
| 0.8166666666666668 | 0 |
| 0.8173611111111111 | 0 |
| 0.8180555555555555 | 0 |
| 0.81875 | 0 |
| 0.8194444444444445 | 0 |
| 0.8201388888888889 | 0 |
| 0.8208333333333333 | 0 |
| 0.8215277777777777 | 0 |
| 0.8222222222222223 | 0 |
| 0.8229166666666666 | 0 |
| 0.8236111111111111 | 0 |
| 0.8243055555555556 | 0 |
| 0.8250000000000001 | 0 |
| 0.8256944444444444 | 0 |
| 0.8263888888888888 | 0 |
| 0.8270833333333334 | 0 |
| 0.8277777777777778 | 0 |
| 0.8284722222222222 | 0 |
| 0.8291666666666666 | 0 |
| 0.8298611111111112 | 0 |
| 0.8305555555555556 | 0 |
| 0.8312499999999999 | 0 |
| 0.8319444444444444 | 0 |
| 0.8326388888888889 | 0 |
| 0.8333333333333334 | 0 |
| 0.8340277777777777 | 0 |
| 0.8347222222222223 | 0 |
| 0.8354166666666667 | 0 |
| 0.8361111111111111 | 0 |
| 0.8368055555555555 | 0 |
| 0.8375 | 0 |
| 0.8381944444444445 | 0 |
| 0.8388888888888889 | 0 |
| 0.8395833333333332 | 0 |
| 0.8402777777777778 | 0 |
| 0.8409722222222222 | 0 |
| 0.8416666666666667 | 0 |
| 0.842361111111111 | 0 |
| 0.8430555555555556 | 0 |
| 0.84375 | 0 |
| 0.8444444444444444 | 0 |
| 0.845138888888889 | 0 |
| 0.8458333333333333 | 0 |
| 0.8465277777777778 | 0 |
| 0.8472222222222222 | 0 |
| 0.8479166666666668 | 0 |
| 0.8486111111111111 | 0 |
| 0.8493055555555555 | 0 |
| 0.85 | 0 |
| 0.8506944444444445 | 0 |
| 0.8513888888888889 | 0 |
| 0.8520833333333333 | 0 |
| 0.8527777777777777 | 0 |
| 0.8534722222222223 | 0 |
| 0.8541666666666666 | 0 |
| 0.8548611111111111 | 0 |
| 0.8555555555555556 | 0 |
| 0.8562500000000001 | 0 |
| 0.8569444444444444 | 0 |
| 0.8576388888888888 | 0 |
| 0.8583333333333334 | 0 |
| 0.8590277777777778 | 0 |
| 0.8597222222222222 | 0 |
| 0.8604166666666666 | 0 |
| 0.8611111111111112 | 0 |
| 0.8618055555555556 | 0 |
| 0.8624999999999999 | 0 |
| 0.8631944444444444 | 0 |
| 0.8638888888888889 | 0 |
| 0.8645833333333334 | 0 |
| 0.8652777777777777 | 0 |
| 0.8659722222222223 | 0 |
| 0.8666666666666667 | 0 |
| 0.8673611111111111 | 0 |
| 0.8680555555555555 | 0 |
| 0.86875 | 0 |
| 0.8694444444444445 | 0 |
| 0.8701388888888889 | 0 |
| 0.8708333333333332 | 0 |
| 0.8715277777777778 | 0 |
| 0.8722222222222222 | 0 |
| 0.8729166666666667 | 0 |
| 0.873611111111111 | 0 |
| 0.8743055555555556 | 0 |
| 0.875 | 0 |
| 0.8756944444444444 | 0 |
| 0.876388888888889 | 0 |
| 0.8770833333333333 | 0 |
| 0.8777777777777778 | 0 |
| 0.8784722222222222 | 0 |
| 0.8791666666666668 | 0 |
| 0.8798611111111111 | 0 |
| 0.8805555555555555 | 0 |
| 0.88125 | 0 |
| 0.8819444444444445 | 0 |
| 0.8826388888888889 | 0 |
| 0.8833333333333333 | 0 |
| 0.8840277777777777 | 0 |
| 0.8847222222222223 | 0 |
| 0.8854166666666666 | 0 |
| 0.8861111111111111 | 0 |
| 0.8868055555555556 | 0 |
| 0.8875000000000001 | 0 |
| 0.8881944444444444 | 0 |
| 0.8888888888888888 | 0 |
| 0.8895833333333334 | 0 |
| 0.8902777777777778 | 0 |
| 0.8909722222222222 | 0 |
| 0.8916666666666666 | 0 |
| 0.8923611111111112 | 0 |
| 0.8930555555555556 | 0 |
| 0.8937499999999999 | 0 |
| 0.8944444444444444 | 0 |
| 0.8951388888888889 | 0 |
| 0.8958333333333334 | 0 |
| 0.8965277777777777 | 0 |
| 0.8972222222222223 | 0 |
| 0.8979166666666667 | 0 |
| 0.8986111111111111 | 0 |
| 0.8993055555555555 | 0 |
| 0.9 | 0 |
| 0.9006944444444445 | 0 |
| 0.9013888888888889 | 0 |
| 0.9020833333333332 | 0 |
| 0.9027777777777778 | 0 |
| 0.9034722222222222 | 0 |
| 0.9041666666666667 | 0 |
| 0.904861111111111 | 0 |
| 0.9055555555555556 | 0 |
| 0.90625 | 0 |
| 0.9069444444444444 | 0 |
| 0.907638888888889 | 0 |
| 0.9083333333333333 | 0 |
| 0.9090277777777778 | 0 |
| 0.9097222222222222 | 0 |
| 0.9104166666666668 | 0 |
| 0.9111111111111111 | 0 |
| 0.9118055555555555 | 0 |
| 0.9125 | 0 |
| 0.9131944444444445 | 0 |
| 0.9138888888888889 | 0 |
| 0.9145833333333333 | 0 |
| 0.9152777777777777 | 0 |
| 0.9159722222222223 | 0 |
| 0.9166666666666666 | 0 |
| 0.9173611111111111 | 0 |
| 0.9180555555555556 | 0 |
| 0.9187500000000001 | 0 |
| 0.9194444444444444 | 0 |
| 0.9201388888888888 | 0 |
| 0.9208333333333334 | 0 |
| 0.9215277777777778 | 0 |
| 0.9222222222222222 | 0 |
| 0.9229166666666666 | 0 |
| 0.9236111111111112 | 0 |
| 0.9243055555555556 | 0 |
| 0.9249999999999999 | 0 |
| 0.9256944444444444 | 0 |
| 0.9263888888888889 | 0 |
| 0.9270833333333334 | 0 |
| 0.9277777777777777 | 0 |
| 0.9284722222222223 | 0 |
| 0.9291666666666667 | 0 |
| 0.9298611111111111 | 0 |
| 0.9305555555555555 | 0 |
| 0.93125 | 0 |
| 0.9319444444444445 | 0 |
| 0.9326388888888889 | 0 |
| 0.9333333333333332 | 0 |
| 0.9340277777777778 | 0 |
| 0.9347222222222222 | 0 |
| 0.9354166666666667 | 0 |
| 0.936111111111111 | 0 |
| 0.9368055555555556 | 0 |
| 0.9375 | 0 |
| 0.9381944444444444 | 0 |
| 0.938888888888889 | 0 |
| 0.9395833333333333 | 0 |
| 0.9402777777777778 | 0 |
| 0.9409722222222222 | 0 |
| 0.9416666666666668 | 0 |
| 0.9423611111111111 | 0 |
| 0.9430555555555555 | 0 |
| 0.94375 | 0 |
| 0.9444444444444445 | 0 |
| 0.9451388888888889 | 0 |
| 0.9458333333333333 | 0 |
| 0.9465277777777777 | 0 |
| 0.9472222222222223 | 0 |
| 0.9479166666666666 | 0 |
| 0.9486111111111111 | 0 |
| 0.9493055555555556 | 0 |
| 0.9500000000000001 | 0 |
| 0.9506944444444444 | 0 |
| 0.9513888888888888 | 0 |
| 0.9520833333333334 | 0 |
| 0.9527777777777778 | 0 |
| 0.9534722222222222 | 0 |
| 0.9541666666666666 | 0 |
| 0.9548611111111112 | 0 |
| 0.9555555555555556 | 0 |
| 0.9562499999999999 | 0 |
| 0.9569444444444444 | 0 |
| 0.9576388888888889 | 0 |
| 0.9583333333333334 | 0 |
| 0.9590277777777777 | 0 |
| 0.9597222222222223 | 0 |
| 0.9604166666666667 | 0 |
| 0.9611111111111111 | 0 |
| 0.9618055555555555 | 0 |
| 0.9625 | 0 |
| 0.9631944444444445 | 0 |
| 0.9638888888888889 | 0 |
| 0.9645833333333332 | 0 |
| 0.9652777777777778 | 0 |
| 0.9659722222222222 | 0 |
| 0.9666666666666667 | 0 |
| 0.967361111111111 | 0 |
| 0.9680555555555556 | 0 |
| 0.96875 | 0 |
| 0.9694444444444444 | 0 |
| 0.970138888888889 | 0 |
| 0.9708333333333333 | 0 |
| 0.9715277777777778 | 0 |
| 0.9722222222222222 | 0 |
| 0.9729166666666668 | 0 |
| 0.9736111111111111 | 0 |
| 0.9743055555555555 | 0 |
| 0.975 | 0 |
| 0.9756944444444445 | 0 |
| 0.9763888888888889 | 0 |
| 0.9770833333333333 | 0 |
| 0.9777777777777777 | 0 |
| 0.9784722222222223 | 0 |
| 0.9791666666666666 | 0 |
| 0.9798611111111111 | 0 |
| 0.9805555555555556 | 0 |
| 0.9812500000000001 | 0 |
| 0.9819444444444444 | 0 |
| 0.9826388888888888 | 0 |
| 0.9833333333333334 | 0 |
| 0.9840277777777778 | 0 |
| 0.9847222222222222 | 0 |
| 0.9854166666666666 | 0 |
| 0.9861111111111112 | 0 |
| 0.9868055555555556 | 0 |
| 0.9874999999999999 | 0 |
| 0.9881944444444444 | 0 |
| 0.9888888888888889 | 0 |
| 0.9895833333333334 | 0 |
| 0.9902777777777777 | 0 |
| 0.9909722222222223 | 0 |
| 0.9916666666666667 | 0 |
| 0.9923611111111111 | 0 |
| 0.9930555555555555 | 0 |
| 0.99375 | 0 |
| 0.9944444444444445 | 0 |
| 0.9951388888888889 | 0 |
| 0.9958333333333332 | 0 |
| 0.9965277777777778 | 0 |
| 0.9972222222222222 | 0 |
| 0.9979166666666667 | 0 |
| 0.998611111111111 | 0 |
| 0.9993055555555556 | 0 |